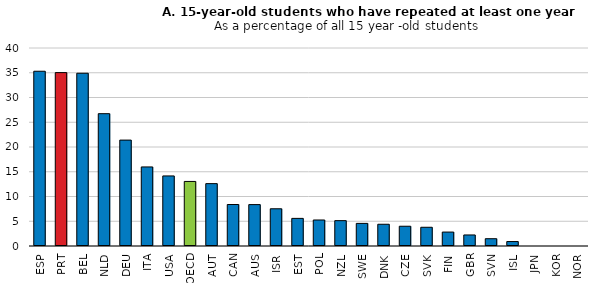
| Category | 15-year-old students who have repeated at least one year (left axis) |
|---|---|
| ESP | 35.304 |
| PRT | 35.031 |
| BEL | 34.901 |
| NLD | 26.731 |
| DEU | 21.395 |
| ITA | 15.975 |
| USA | 14.154 |
| OECD | 13.04 |
| AUT | 12.599 |
| CAN | 8.382 |
| AUS | 8.364 |
| ISR | 7.521 |
| EST | 5.579 |
| POL | 5.254 |
| NZL | 5.121 |
| SWE | 4.57 |
| DNK | 4.392 |
| CZE | 3.992 |
| SVK | 3.785 |
| FIN | 2.813 |
| GBR | 2.229 |
| SVN | 1.472 |
| ISL | 0.898 |
| JPN | 0 |
| KOR | 0 |
| NOR | 0 |